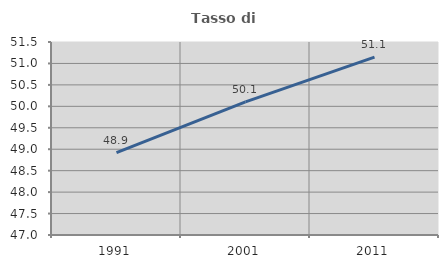
| Category | Tasso di occupazione   |
|---|---|
| 1991.0 | 48.919 |
| 2001.0 | 50.105 |
| 2011.0 | 51.148 |